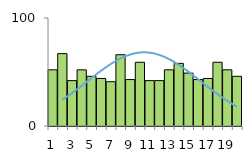
| Category | increment | normal approx. |
|---|---|---|
| 0 | 52 | 21.282 |
| 1 | 67 | 27.265 |
| 2 | 42 | 33.916 |
| 3 | 52 | 40.963 |
| 4 | 46 | 48.038 |
| 5 | 44 | 54.699 |
| 6 | 41 | 60.475 |
| 7 | 66 | 64.919 |
| 8 | 43 | 67.665 |
| 9 | 59 | 68.479 |
| 10 | 42 | 67.291 |
| 11 | 42 | 64.202 |
| 12 | 52 | 59.477 |
| 13 | 58 | 53.499 |
| 14 | 49 | 46.724 |
| 15 | 43 | 39.622 |
| 16 | 44 | 32.624 |
| 17 | 59 | 26.082 |
| 18 | 52 | 20.246 |
| 19 | 46 | 15.259 |